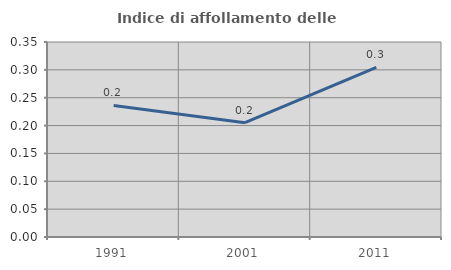
| Category | Indice di affollamento delle abitazioni  |
|---|---|
| 1991.0 | 0.236 |
| 2001.0 | 0.205 |
| 2011.0 | 0.304 |